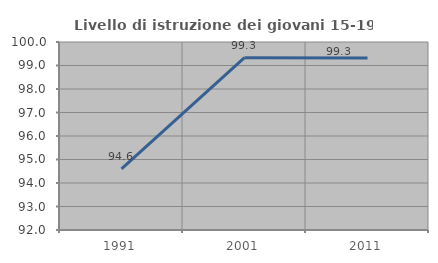
| Category | Livello di istruzione dei giovani 15-19 anni |
|---|---|
| 1991.0 | 94.602 |
| 2001.0 | 99.331 |
| 2011.0 | 99.315 |